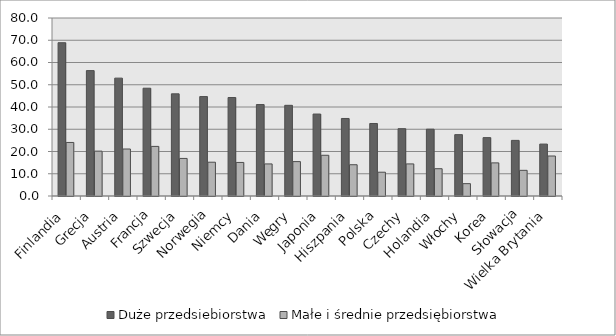
| Category | Duże przedsiebiorstwa | Małe i średnie przedsiębiorstwa |
|---|---|---|
| Finlandia | 68.896 | 24.065 |
| Grecja | 56.354 | 20.166 |
| Austria | 52.971 | 21.117 |
| Francja | 48.443 | 22.293 |
| Szwecja | 45.916 | 16.886 |
| Norwegia | 44.681 | 15.184 |
| Niemcy | 44.26 | 15.078 |
| Dania | 41.102 | 14.417 |
| Węgry | 40.752 | 15.459 |
| Japonia | 36.832 | 18.304 |
| Hiszpania | 34.844 | 14.057 |
| Polska | 32.584 | 10.689 |
| Czechy | 30.252 | 14.421 |
| Holandia | 30.021 | 12.265 |
| Włochy | 27.574 | 5.555 |
| Korea | 26.234 | 14.886 |
| Słowacja | 25 | 11.532 |
| Wielka Brytania | 23.329 | 17.973 |